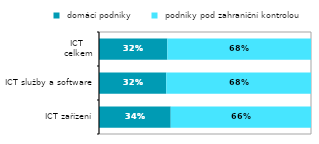
| Category |  domácí podniky |  podniky pod zahraniční kontrolou |
|---|---|---|
|   ICT zařízení | 0.338 | 0.662 |
|  ICT služby a software | 0.317 | 0.683 |
| ICT 
celkem | 0.322 | 0.678 |